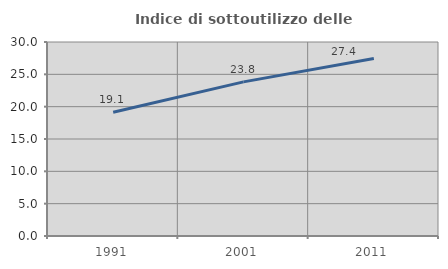
| Category | Indice di sottoutilizzo delle abitazioni  |
|---|---|
| 1991.0 | 19.126 |
| 2001.0 | 23.837 |
| 2011.0 | 27.439 |